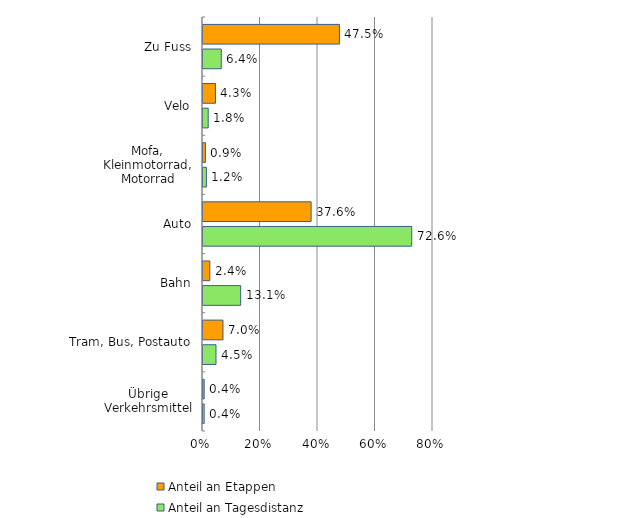
| Category | Anteil an Etappen | Anteil an Tagesdistanz |
|---|---|---|
| Zu Fuss | 47.472 | 6.361 |
| Velo | 4.339 | 1.812 |
| Mofa, Kleinmotorrad, Motorrad | 0.851 | 1.188 |
| Auto | 37.607 | 72.604 |
| Bahn | 2.372 | 13.113 |
| Tram, Bus, Postauto | 6.955 | 4.522 |
| Übrige Verkehrsmittel | 0.405 | 0.401 |